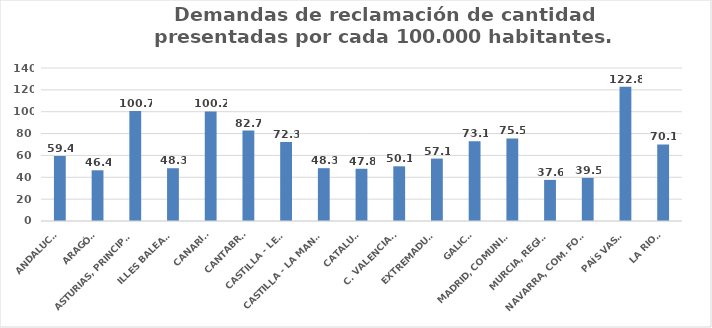
| Category | Series 0 |
|---|---|
| ANDALUCÍA | 59.444 |
| ARAGÓN | 46.403 |
| ASTURIAS, PRINCIPADO | 100.747 |
| ILLES BALEARS | 48.289 |
| CANARIAS | 100.211 |
| CANTABRIA | 82.704 |
| CASTILLA - LEÓN | 72.277 |
| CASTILLA - LA MANCHA | 48.339 |
| CATALUÑA | 47.795 |
| C. VALENCIANA | 50.051 |
| EXTREMADURA | 57.102 |
| GALICIA | 73.071 |
| MADRID, COMUNIDAD | 75.514 |
| MURCIA, REGIÓN | 37.612 |
| NAVARRA, COM. FORAL | 39.481 |
| PAÍS VASCO | 122.78 |
| LA RIOJA | 70.113 |